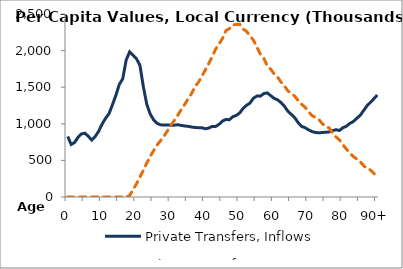
| Category | Private Transfers, Inflows | Private Transfers, Outflows |
|---|---|---|
| 0 | 827219.091 | 0 |
|  | 717622.594 | 0 |
| 2 | 745146.262 | 0 |
| 3 | 815200.626 | 0 |
| 4 | 862192.798 | 0 |
| 5 | 872118.874 | 0 |
| 6 | 828054.936 | 0 |
| 7 | 777860.551 | 0 |
| 8 | 826885.591 | 0 |
| 9 | 898584.385 | 0 |
| 10 | 996393.827 | 0 |
| 11 | 1075064.393 | 0 |
| 12 | 1138079.403 | 0 |
| 13 | 1259800.192 | 0 |
| 14 | 1389021.705 | 0 |
| 15 | 1538656.316 | 10.37 |
| 16 | 1615399.672 | 180.157 |
| 17 | 1872142.921 | 1390.414 |
| 18 | 1982823.072 | 20344.202 |
| 19 | 1937294.615 | 100324.676 |
| 20 | 1887653.818 | 180623.613 |
| 21 | 1797760.617 | 272592.171 |
| 22 | 1503188.517 | 365454.884 |
| 23 | 1263401.96 | 464627.48 |
| 24 | 1131374.227 | 557020.734 |
| 25 | 1052790.94 | 635130.999 |
| 26 | 1006393.517 | 711600.168 |
| 27 | 985726.826 | 770574.043 |
| 28 | 983377.973 | 830157.78 |
| 29 | 984426.288 | 903987.741 |
| 30 | 980470.725 | 981033.241 |
| 31 | 981165.092 | 1047103.576 |
| 32 | 987143.051 | 1117379.778 |
| 33 | 977899.027 | 1194619.91 |
| 34 | 970352.055 | 1263760.412 |
| 35 | 965490.852 | 1342598.568 |
| 36 | 956205.741 | 1412270.143 |
| 37 | 949441.808 | 1506406.264 |
| 38 | 946854.801 | 1567474.272 |
| 39 | 946067.503 | 1649774.751 |
| 40 | 932318.003 | 1736117.69 |
| 41 | 941074.325 | 1822396.213 |
| 42 | 964640.307 | 1916697.844 |
| 43 | 963437.932 | 2019476.496 |
| 44 | 993207.704 | 2091137.113 |
| 45 | 1037494.732 | 2167086.733 |
| 46 | 1059743.96 | 2271735.921 |
| 47 | 1055295.496 | 2301353.616 |
| 48 | 1096965.576 | 2350553.757 |
| 49 | 1114161.497 | 2357496.367 |
| 50 | 1148673.262 | 2360123.996 |
| 51 | 1211527.196 | 2295011.286 |
| 52 | 1253058.252 | 2261487.655 |
| 53 | 1283380.007 | 2203934.813 |
| 54 | 1349959.773 | 2141848.202 |
| 55 | 1378571.019 | 2047354.84 |
| 56 | 1377938.624 | 1951009.361 |
| 57 | 1412224.222 | 1896777.268 |
| 58 | 1422862.466 | 1792218.691 |
| 59 | 1384866.334 | 1747658.722 |
| 60 | 1347901.465 | 1681914.71 |
| 61 | 1328354.11 | 1639860.101 |
| 62 | 1290369.282 | 1570061.868 |
| 63 | 1240484.028 | 1518930.804 |
| 64 | 1171625.589 | 1448737.815 |
| 65 | 1128905.429 | 1421186.646 |
| 66 | 1084285.164 | 1375954.7 |
| 67 | 1015143.823 | 1317402.94 |
| 68 | 963777.856 | 1266305.552 |
| 69 | 946851.608 | 1227237.934 |
| 70 | 917609.128 | 1165871.298 |
| 71 | 894646.953 | 1113392.146 |
| 72 | 881749.624 | 1087516.537 |
| 73 | 876309.409 | 1059223.001 |
| 74 | 881692.237 | 1002961.956 |
| 75 | 883897.137 | 959953.136 |
| 76 | 889403.948 | 944479.363 |
| 77 | 905791.82 | 875000.882 |
| 78 | 919888.708 | 820928.632 |
| 79 | 908669.183 | 779621.872 |
| 80 | 946153.074 | 715129.111 |
| 81 | 965897.908 | 654660.956 |
| 82 | 1004673.867 | 603041.383 |
| 83 | 1029634.841 | 553992.514 |
| 84 | 1073527.614 | 520888.977 |
| 85 | 1112872.928 | 483767.764 |
| 86 | 1179659.703 | 431277.968 |
| 87 | 1244872.151 | 386393.827 |
| 88 | 1291211.967 | 370408.513 |
| 89 | 1342227.313 | 322695.591 |
| 90+ | 1393242.66 | 274982.67 |